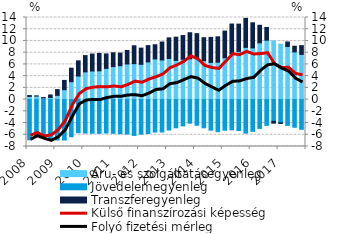
| Category | Áru- és szolgáltatásegyenleg | Jövedelemegyenleg | Transzferegyenleg |
|---|---|---|---|
| 2008.0 | 0.542 | -6.855 | 0.144 |
| 2008.0 | 0.607 | -6.318 | 0.016 |
| 2008.0 | 0.276 | -6.627 | 0.057 |
| 2008.0 | 0.356 | -6.874 | 0.434 |
| 2009.0 | 0.725 | -6.896 | 0.982 |
| 2009.0 | 1.689 | -6.9 | 1.582 |
| 2009.0 | 3.052 | -6.333 | 2.306 |
| 2009.0 | 4.018 | -5.649 | 2.584 |
| 2010.0 | 4.723 | -5.709 | 2.785 |
| 2010.0 | 4.875 | -5.734 | 2.897 |
| 2010.0 | 4.906 | -5.753 | 2.976 |
| 2010.0 | 5.323 | -5.696 | 2.468 |
| 2011.0 | 5.632 | -5.751 | 2.353 |
| 2011.0 | 5.782 | -5.822 | 2.145 |
| 2011.0 | 6.075 | -5.873 | 2.309 |
| 2011.0 | 6.133 | -6.11 | 3.044 |
| 2012.0 | 6.016 | -5.905 | 2.764 |
| 2012.0 | 6.423 | -5.787 | 2.783 |
| 2012.0 | 6.938 | -5.537 | 2.417 |
| 2012.0 | 6.753 | -5.533 | 3.069 |
| 2013.0 | 7.019 | -5.186 | 3.511 |
| 2013.0 | 6.687 | -4.813 | 3.957 |
| 2013.0 | 6.877 | -4.482 | 4.041 |
| 2013.0 | 6.964 | -4.021 | 4.439 |
| 2014.0 | 7.045 | -4.377 | 4.196 |
| 2014.0 | 6.644 | -4.812 | 3.911 |
| 2014.0 | 6.34 | -5.216 | 4.266 |
| 2014.0 | 6.376 | -5.477 | 4.328 |
| 2015.0 | 7.133 | -5.219 | 4.55 |
| 2015.0 | 7.828 | -5.159 | 5.057 |
| 2015.0 | 8.226 | -5.27 | 4.646 |
| 2015.0 | 8.908 | -5.712 | 4.937 |
| 2016.0 | 8.812 | -5.41 | 4.288 |
| 2016.0 | 9.679 | -4.913 | 2.992 |
| 2016.0 | 10.136 | -4.389 | 2.166 |
| 2016.0 | 10.012 | -3.705 | -0.312 |
| 2017.0 | 9.451 | -3.977 | -0.089 |
| 2017.0 | 9.056 | -4.403 | 0.771 |
| 2017.0 | 8.135 | -4.714 | 0.964 |
| 2017.0 | 7.706 | -5.071 | 1.499 |